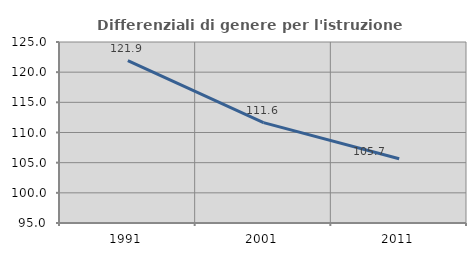
| Category | Differenziali di genere per l'istruzione superiore |
|---|---|
| 1991.0 | 121.912 |
| 2001.0 | 111.64 |
| 2011.0 | 105.661 |